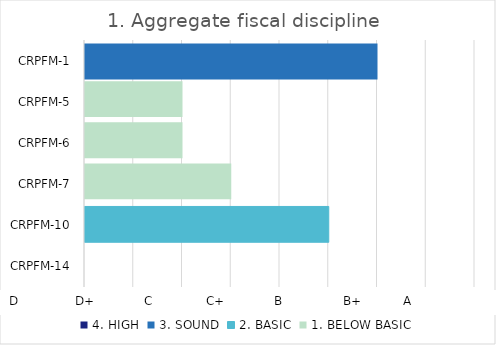
| Category | 4. HIGH | 3. SOUND | 2. BASIC | 1. BELOW BASIC |
|---|---|---|---|---|
| CRPFM-14 | 0 | 0 | 0 | 0 |
| CRPFM-10 | 0 | 0 | 2.5 | 0 |
| CRPFM-7 | 0 | 0 | 0 | 1.5 |
| CRPFM-6 | 0 | 0 | 0 | 1 |
| CRPFM-5 | 0 | 0 | 0 | 1 |
| CRPFM-1 | 0 | 3 | 0 | 0 |